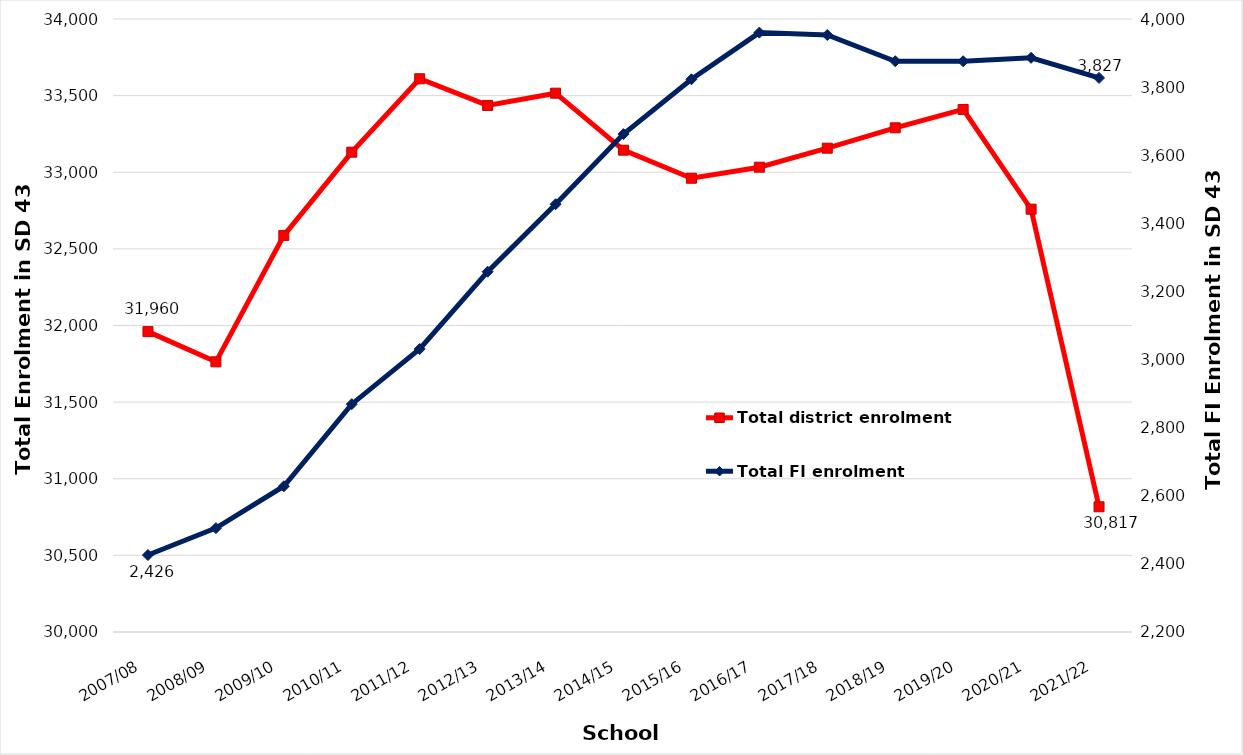
| Category | Total district enrolment  |
|---|---|
| 2007/08 | 31960 |
| 2008/09 | 31763 |
| 2009/10 | 32588 |
| 2010/11 | 33131 |
| 2011/12 | 33610 |
| 2012/13 | 33436 |
| 2013/14 | 33516 |
| 2014/15 | 33144 |
| 2015/16 | 32961 |
| 2016/17 | 33033 |
| 2017/18 | 33157 |
| 2018/19 | 33290 |
| 2019/20 | 33410 |
| 2020/21 | 32759 |
| 2021/22 | 30817 |